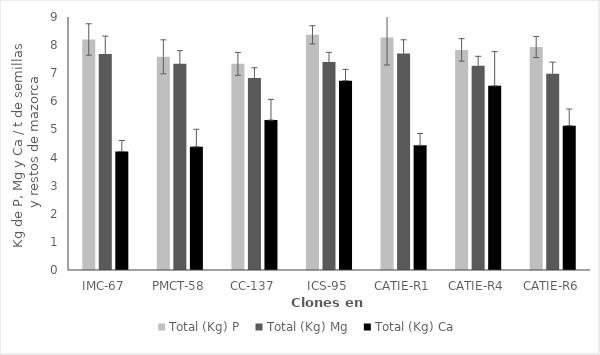
| Category | Total (Kg) P | Total (Kg) Mg | Total (Kg) Ca |
|---|---|---|---|
| IMC-67 | 8.2 | 7.683 | 4.217 |
| PMCT-58 | 7.583 | 7.333 | 4.383 |
| CC-137 | 7.333 | 6.833 | 5.333 |
| ICS-95 | 8.367 | 7.4 | 6.733 |
| CATIE-R1 | 8.267 | 7.7 | 4.433 |
| CATIE-R4 | 7.83 | 7.267 | 6.55 |
| CATIE-R6 | 7.933 | 6.983 | 5.133 |